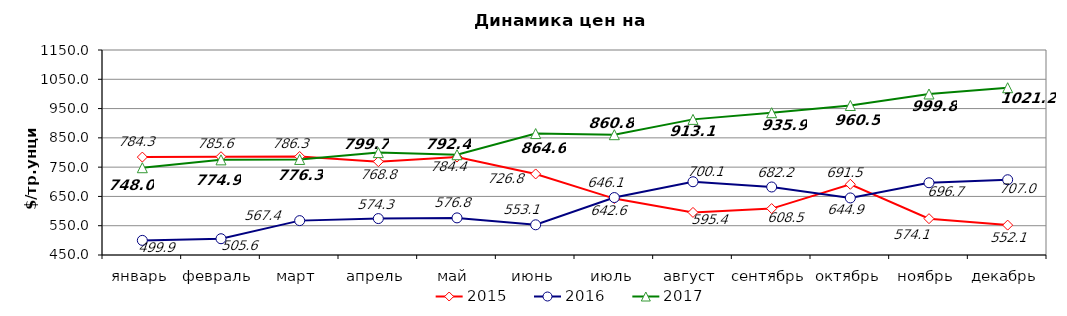
| Category | 2015 | 2016 | 2017 |
|---|---|---|---|
| январь | 784.33 | 499.9 | 748 |
| февраль | 785.55 | 505.57 | 774.9 |
| март | 786.32 | 567.38 | 776.3 |
| апрель | 768.8 | 574.33 | 799.67 |
| май | 784.42 | 576.75 | 792.43 |
| июнь | 726.77 | 553.09 | 864.64 |
| июль | 642.57 | 646.14 | 860.8 |
| август | 595.4 | 700.09 | 913.1 |
| сентябрь | 608.5 | 682.23 | 935.85 |
| октябрь | 691.5 | 644.85 | 960.52 |
| ноябрь | 574.05 | 696.68 | 999.8 |
| декабрь | 552.05 | 706.98 | 1021.16 |